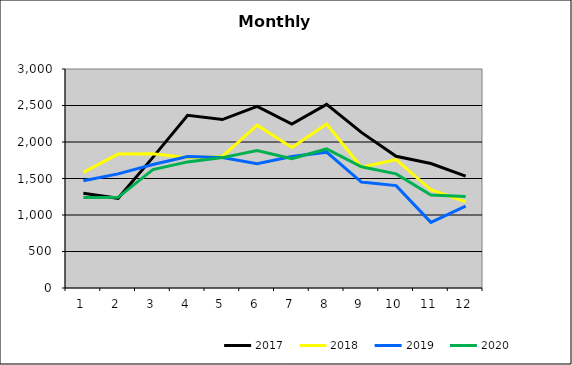
| Category | 2017 | 2018 | 2019 | 2020 |
|---|---|---|---|---|
| 0 | 1297.347 | 1584.945 | 1467.961 | 1241.004 |
| 1 | 1228.546 | 1834.566 | 1563.301 | 1241.851 |
| 2 | 1789.782 | 1838.878 | 1692.17 | 1621.652 |
| 3 | 2364.914 | 1785.082 | 1799.954 | 1727.428 |
| 4 | 2307.576 | 1801.761 | 1787.008 | 1786.296 |
| 5 | 2488.575 | 2229.629 | 1700.928 | 1883.545 |
| 6 | 2244.746 | 1923.685 | 1800.379 | 1770.95 |
| 7 | 2515.952 | 2246.519 | 1860.378 | 1904.479 |
| 8 | 2131.972 | 1654.017 | 1451.067 | 1660.584 |
| 9 | 1804.009 | 1760.102 | 1402.587 | 1563.132 |
| 10 | 1705.861 | 1345.712 | 899.124 | 1275.047 |
| 11 | 1533.212 | 1179.594 | 1120.919 | 1254.213 |